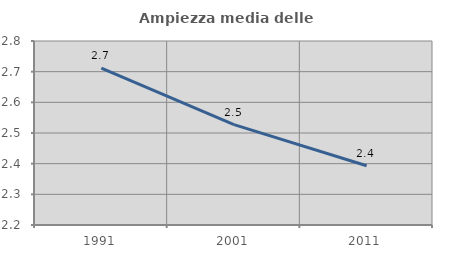
| Category | Ampiezza media delle famiglie |
|---|---|
| 1991.0 | 2.711 |
| 2001.0 | 2.527 |
| 2011.0 | 2.393 |